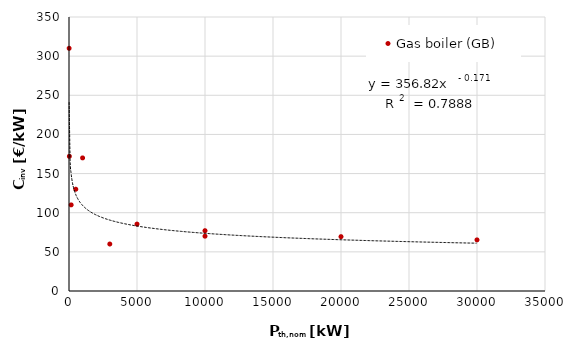
| Category | Gas boiler (GB) |
|---|---|
| 500.0 | 130 |
| 10000.0 | 70 |
| 10.0 | 310 |
| 160.0 | 110 |
| 3000.0 | 60 |
| 25.0 | 172 |
| 1000.0 | 170 |
| 5000.0 | 85.464 |
| 10000.0 | 77.025 |
| 20000.0 | 69.418 |
| 30000.0 | 65.322 |